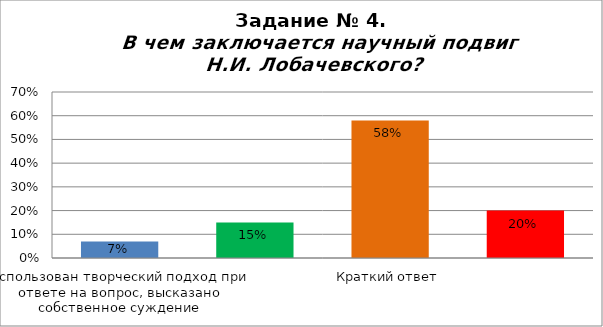
| Category | В чем заключается научный подвиг Н.И. Лобачевского? |
|---|---|
| Использован творческий подход при ответе на вопрос, высказано собственное суждение | 0.07 |
| При ответе на вопрос использованы материалы текста, без собственной оценки событий | 0.15 |
| Краткий ответ | 0.58 |
| Неверный ответ или не приступал | 0.2 |